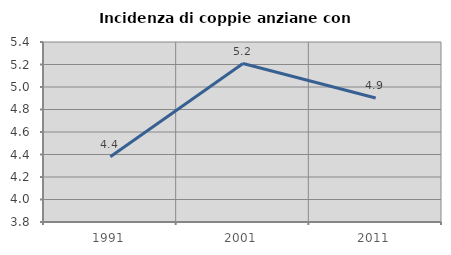
| Category | Incidenza di coppie anziane con figli |
|---|---|
| 1991.0 | 4.38 |
| 2001.0 | 5.208 |
| 2011.0 | 4.902 |